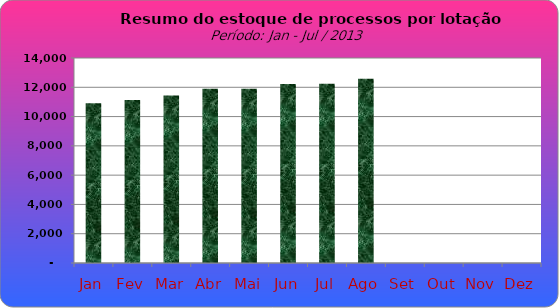
| Category | Series 0 |
|---|---|
| Jan | 10909 |
| Fev | 11131 |
| Mar | 11446 |
| Abr | 11893 |
| Mai | 11901 |
| Jun | 12228 |
| Jul | 12248 |
| Ago | 12576 |
| Set | 0 |
| Out | 0 |
| Nov | 0 |
| Dez | 0 |